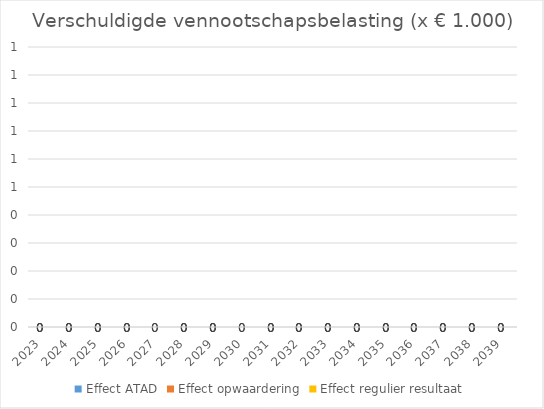
| Category | Effect ATAD | Effect opwaardering | Effect regulier resultaat |
|---|---|---|---|
| 2023.0 | 0 | 0 | 0 |
| 2024.0 | 0 | 0 | 0 |
| 2025.0 | 0 | 0 | 0 |
| 2026.0 | 0 | 0 | 0 |
| 2027.0 | 0 | 0 | 0 |
| 2028.0 | 0 | 0 | 0 |
| 2029.0 | 0 | 0 | 0 |
| 2030.0 | 0 | 0 | 0 |
| 2031.0 | 0 | 0 | 0 |
| 2032.0 | 0 | 0 | 0 |
| 2033.0 | 0 | 0 | 0 |
| 2034.0 | 0 | 0 | 0 |
| 2035.0 | 0 | 0 | 0 |
| 2036.0 | 0 | 0 | 0 |
| 2037.0 | 0 | 0 | 0 |
| 2038.0 | 0 | 0 | 0 |
| 2039.0 | 0 | 0 | 0 |